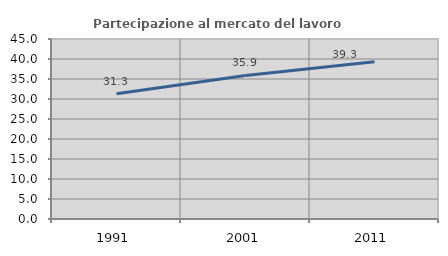
| Category | Partecipazione al mercato del lavoro  femminile |
|---|---|
| 1991.0 | 31.322 |
| 2001.0 | 35.89 |
| 2011.0 | 39.338 |